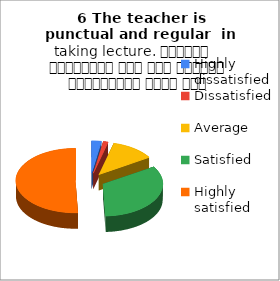
| Category | 6 The teacher is punctual and regular  in taking lecture. शिक्षक समयनिष्ठ हैं एवं नियमित व्याख्यान देते हैं |
|---|---|
| Highly dissatisfied | 2 |
| Dissatisfied | 1 |
| Average | 9 |
| Satisfied | 25 |
| Highly satisfied | 38 |